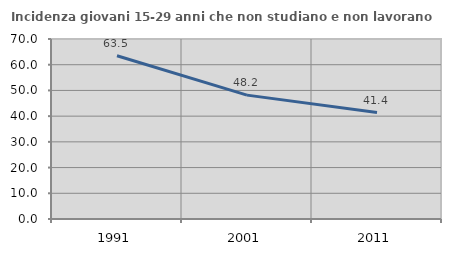
| Category | Incidenza giovani 15-29 anni che non studiano e non lavorano  |
|---|---|
| 1991.0 | 63.484 |
| 2001.0 | 48.176 |
| 2011.0 | 41.41 |